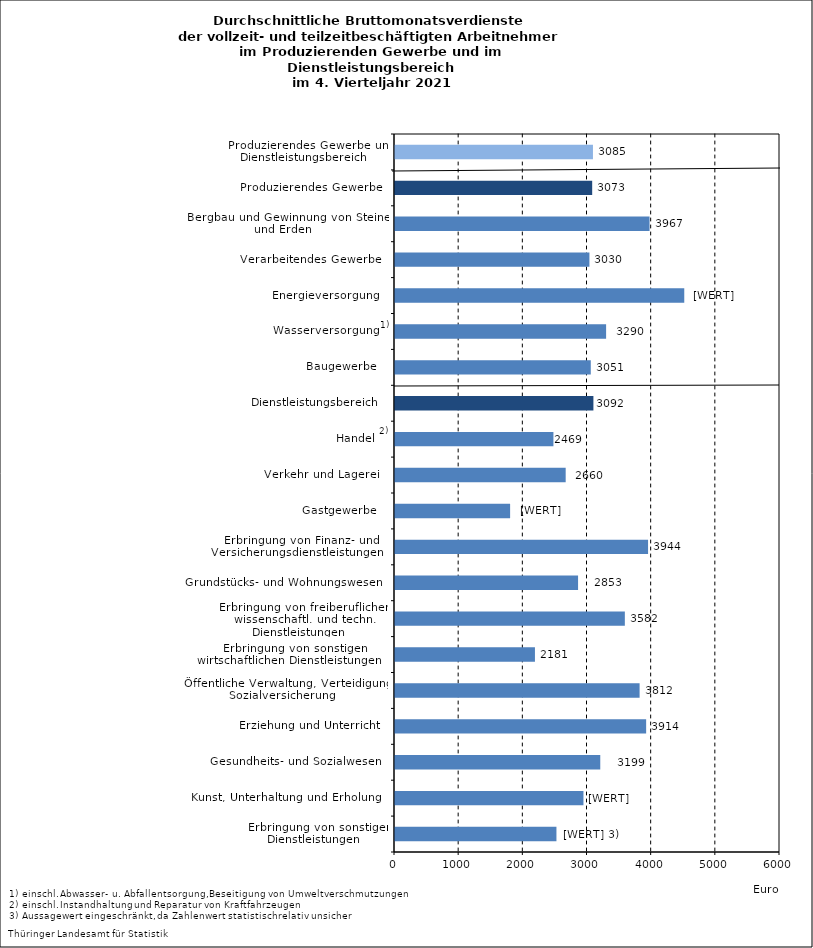
| Category | Series 0 |
|---|---|
| Erbringung von sonstigen Dienstleistungen    | 2516 |
| Kunst, Unterhaltung und Erholung    | 2937 |
| Gesundheits- und Sozialwesen    | 3199 |
| Erziehung und Unterricht    | 3914 |
| Öffentliche Verwaltung, Verteidigung, Sozialversicherung    | 3812 |
| Erbringung von sonstigen wirtschaftlichen Dienstleistungen    | 2181 |
| Erbringung von freiberuflichen, wissenschaftl. und techn. Dienstleistungen    | 3582 |
| Grundstücks- und Wohnungswesen    | 2853 |
| Erbringung von Finanz- und Versicherungsdienstleistungen    | 3944 |
| Gastgewerbe    | 1794 |
| Verkehr und Lagerei    | 2660 |
| Handel    | 2469 |
| Dienstleistungsbereich    | 3092 |
| Baugewerbe    | 3051 |
| Wasserversorgung    | 3290 |
| Energieversorgung    | 4508 |
| Verarbeitendes Gewerbe    | 3030 |
| Bergbau und Gewinnung von Steinen und Erden    | 3967 |
| Produzierendes Gewerbe    | 3073 |
| Produzierendes Gewerbe und Dienstleistungsbereich    | 3085 |